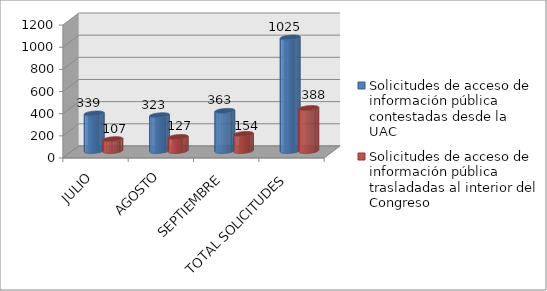
| Category | Solicitudes de acceso de información pública contestadas desde la UAC | Solicitudes de acceso de información pública trasladadas al interior del Congreso |
|---|---|---|
| JULIO | 339 | 107 |
| AGOSTO | 323 | 127 |
| SEPTIEMBRE | 363 | 154 |
| TOTAL SOLICITUDES | 1025 | 388 |